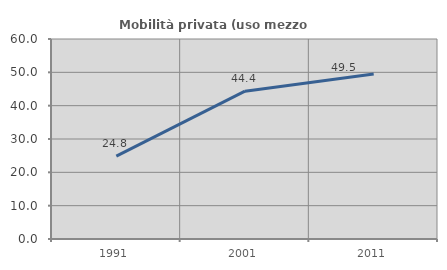
| Category | Mobilità privata (uso mezzo privato) |
|---|---|
| 1991.0 | 24.848 |
| 2001.0 | 44.355 |
| 2011.0 | 49.485 |